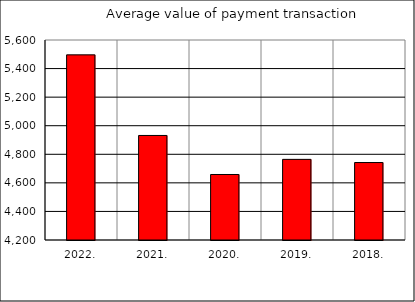
| Category | Average value of payment transaction |
|---|---|
| 2022. | 5496 |
| 2021. | 4931.816 |
| 2020. | 4658.548 |
| 2019. | 4764.383 |
| 2018. | 4742.211 |